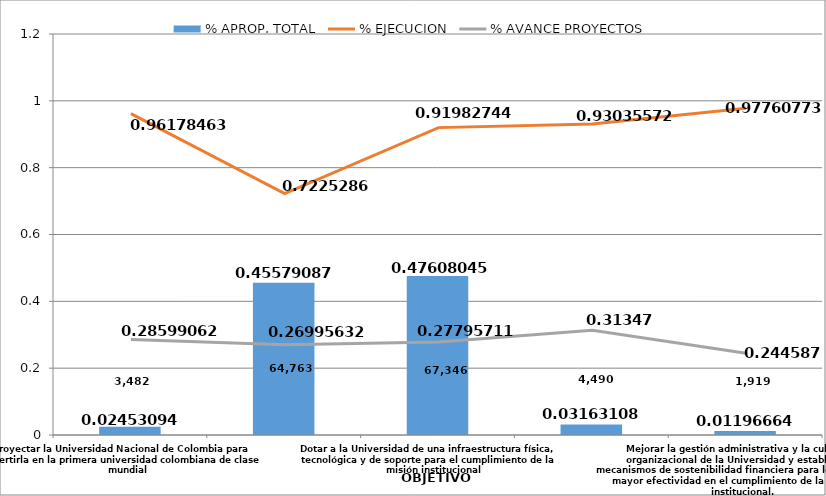
| Category | % APROP. TOTAL |
|---|---|
| Proyectar la Universidad Nacional de Colombia para convertirla en la primera universidad colombiana de clase mundial | 0.025 |
| Consolidar el liderazgo de la Universidad en el Sistema de Educación Superior Colombiano | 0.456 |
| Dotar a la Universidad de una infraestructura física, tecnológica y de soporte para el cumplimiento de la misión institucional | 0.476 |
| Consolidar el Sistema de Bienestar Universitario, que facilite el desarrollo de actividades académicas en ambientes adecuados.. | 0.032 |
| Mejorar la gestión administrativa y la cultura organizacional de la Universidad y establecer mecanismos de sostenibilidad financiera para lograr una mayor efectividad en el cumplimiento de la misión institucional. | 0.012 |